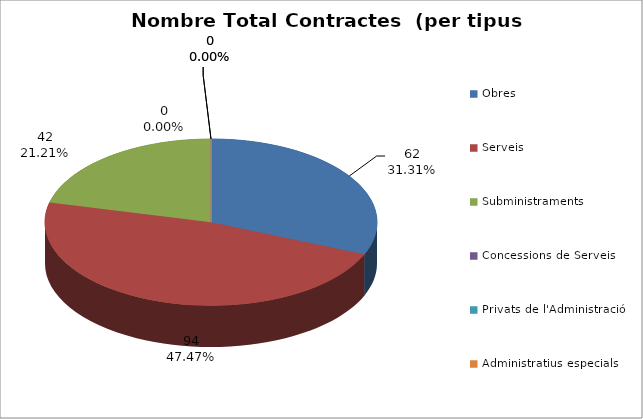
| Category | Nombre Total Contractes |
|---|---|
| Obres | 62 |
| Serveis | 94 |
| Subministraments | 42 |
| Concessions de Serveis | 0 |
| Privats de l'Administració | 0 |
| Administratius especials | 0 |